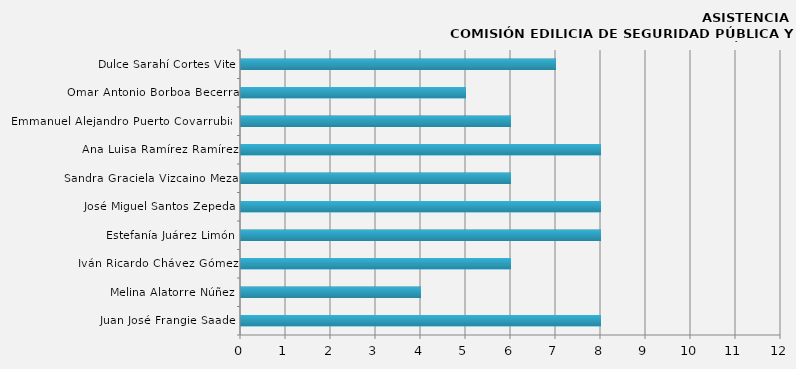
| Category | Series 0 |
|---|---|
| Juan José Frangie Saade | 8 |
| Melina Alatorre Núñez | 4 |
| Iván Ricardo Chávez Gómez | 6 |
| Estefanía Juárez Limón | 8 |
| José Miguel Santos Zepeda | 8 |
| Sandra Graciela Vizcaino Meza | 6 |
| Ana Luisa Ramírez Ramírez | 8 |
| Emmanuel Alejandro Puerto Covarrubias | 6 |
| Omar Antonio Borboa Becerra | 5 |
| Dulce Sarahí Cortes Vite | 7 |